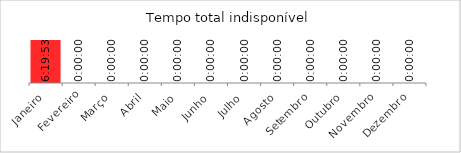
| Category | Tempo total indisponível |
|---|---|
| Janeiro | 0.264 |
| Fevereiro | 0 |
| Março | 0 |
| Abril | 0 |
| Maio | 0 |
| Junho | 0 |
| Julho | 0 |
| Agosto | 0 |
| Setembro | 0 |
| Outubro | 0 |
| Novembro | 0 |
| Dezembro | 0 |